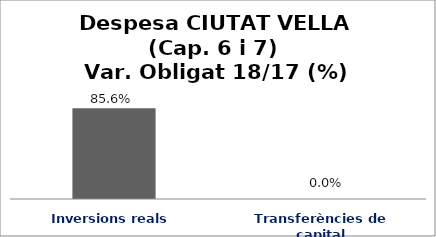
| Category | Series 0 |
|---|---|
| Inversions reals | 0.856 |
| Transferències de capital | 0 |